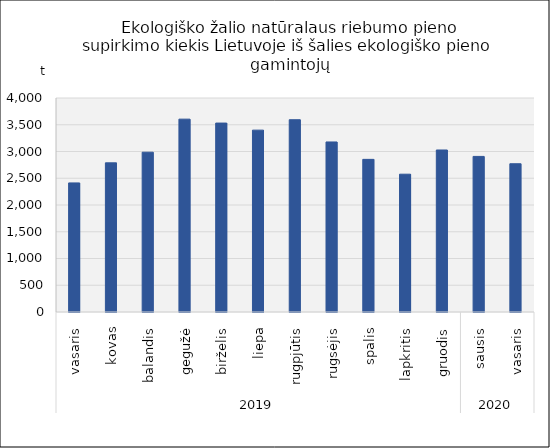
| Category | Ekologiško žalio natūralaus riebumo pieno supirkimo kiekis Lietuvoje iš šalies ekologiško pieno gamintojų |
|---|---|
| 0 | 2412.69 |
| 1 | 2788.116 |
| 2 | 2986.6 |
| 3 | 3604.56 |
| 4 | 3531.43 |
| 5 | 3399.389 |
| 6 | 3593.97 |
| 7 | 3178.38 |
| 8 | 2853.02 |
| 9 | 2575.8 |
| 10 | 3028.194 |
| 11 | 2908.04 |
| 12 | 2771.079 |